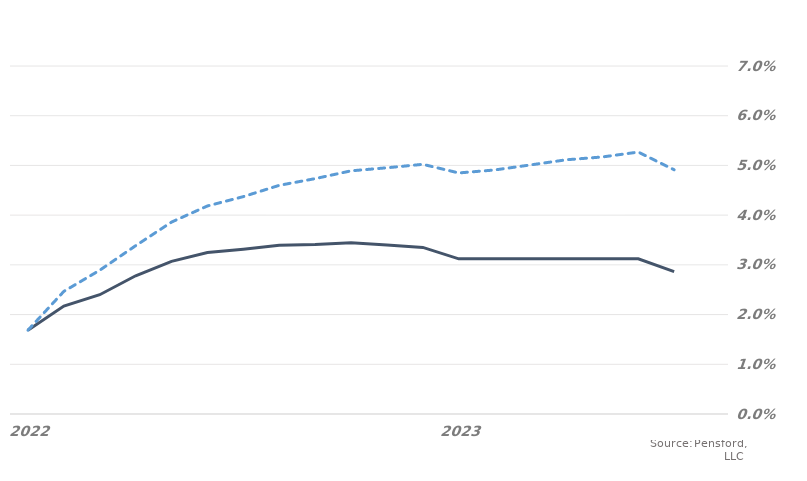
| Category | MARKET EXPECTATIONS | +1 Standard Deviation |
|---|---|---|
| 2022-06-30 | 0.017 | 0.017 |
| 2022-07-30 | 0.022 | 0.025 |
| 2022-08-30 | 0.024 | 0.029 |
| 2022-09-30 | 0.028 | 0.034 |
| 2022-10-30 | 0.031 | 0.039 |
| 2022-11-30 | 0.032 | 0.042 |
| 2022-12-30 | 0.033 | 0.044 |
| 2023-01-30 | 0.034 | 0.046 |
| 2023-02-28 | 0.034 | 0.047 |
| 2023-03-28 | 0.034 | 0.049 |
| 2023-04-28 | 0.034 | 0.05 |
| 2023-05-28 | 0.034 | 0.05 |
| 2023-06-28 | 0.031 | 0.048 |
| 2023-07-28 | 0.031 | 0.049 |
| 2023-08-28 | 0.031 | 0.05 |
| 2023-09-28 | 0.031 | 0.051 |
| 2023-10-28 | 0.031 | 0.052 |
| 2023-11-28 | 0.031 | 0.053 |
| 2023-12-28 | 0.029 | 0.049 |
| 2024-01-28 | 0.028 | 0.049 |
| 2024-02-28 | 0.028 | 0.049 |
| 2024-03-28 | 0.028 | 0.05 |
| 2024-04-28 | 0.028 | 0.049 |
| 2024-05-28 | 0.028 | 0.048 |
| 2024-06-28 | 0.026 | 0.046 |
| 2024-07-28 | 0.026 | 0.045 |
| 2024-08-28 | 0.026 | 0.046 |
| 2024-09-28 | 0.026 | 0.046 |
| 2024-10-28 | 0.026 | 0.047 |
| 2024-11-28 | 0.026 | 0.047 |
| 2024-12-28 | 0.026 | 0.047 |
| 2025-01-28 | 0.026 | 0.048 |
| 2025-02-28 | 0.026 | 0.048 |
| 2025-03-28 | 0.026 | 0.048 |
| 2025-04-28 | 0.026 | 0.049 |
| 2025-05-28 | 0.026 | 0.049 |
| 2025-06-28 | 0.026 | 0.049 |
| 2025-07-28 | 0.026 | 0.05 |
| 2025-08-28 | 0.026 | 0.05 |
| 2025-09-28 | 0.026 | 0.05 |
| 2025-10-28 | 0.026 | 0.051 |
| 2025-11-28 | 0.026 | 0.051 |
| 2025-12-28 | 0.026 | 0.051 |
| 2026-01-28 | 0.026 | 0.052 |
| 2026-02-28 | 0.026 | 0.052 |
| 2026-03-28 | 0.026 | 0.052 |
| 2026-04-28 | 0.026 | 0.052 |
| 2026-05-28 | 0.026 | 0.052 |
| 2026-06-28 | 0.027 | 0.052 |
| 2026-07-28 | 0.027 | 0.052 |
| 2026-08-28 | 0.027 | 0.053 |
| 2026-09-28 | 0.027 | 0.053 |
| 2026-10-28 | 0.027 | 0.053 |
| 2026-11-28 | 0.027 | 0.053 |
| 2026-12-28 | 0.027 | 0.054 |
| 2027-01-28 | 0.027 | 0.054 |
| 2027-02-28 | 0.027 | 0.054 |
| 2027-03-28 | 0.027 | 0.054 |
| 2027-04-28 | 0.027 | 0.054 |
| 2027-05-28 | 0.027 | 0.054 |
| 2027-06-28 | 0.027 | 0.054 |
| 2027-07-28 | 0.027 | 0.054 |
| 2027-08-28 | 0.027 | 0.055 |
| 2027-09-28 | 0.027 | 0.055 |
| 2027-10-28 | 0.027 | 0.055 |
| 2027-11-28 | 0.027 | 0.055 |
| 2027-12-28 | 0.027 | 0.055 |
| 2028-01-28 | 0.027 | 0.056 |
| 2028-02-28 | 0.027 | 0.056 |
| 2028-03-28 | 0.027 | 0.056 |
| 2028-04-28 | 0.027 | 0.056 |
| 2028-05-28 | 0.027 | 0.055 |
| 2028-06-28 | 0.027 | 0.055 |
| 2028-07-28 | 0.027 | 0.055 |
| 2028-08-28 | 0.027 | 0.055 |
| 2028-09-28 | 0.027 | 0.056 |
| 2028-10-28 | 0.027 | 0.056 |
| 2028-11-28 | 0.027 | 0.056 |
| 2028-12-28 | 0.027 | 0.056 |
| 2029-01-28 | 0.027 | 0.056 |
| 2029-02-28 | 0.027 | 0.057 |
| 2029-03-28 | 0.027 | 0.057 |
| 2029-04-28 | 0.027 | 0.057 |
| 2029-05-28 | 0.027 | 0.058 |
| 2029-06-28 | 0.028 | 0.059 |
| 2029-07-28 | 0.028 | 0.059 |
| 2029-08-28 | 0.028 | 0.06 |
| 2029-09-28 | 0.028 | 0.06 |
| 2029-10-28 | 0.028 | 0.06 |
| 2029-11-28 | 0.028 | 0.06 |
| 2029-12-28 | 0.028 | 0.06 |
| 2030-01-28 | 0.028 | 0.061 |
| 2030-02-28 | 0.028 | 0.061 |
| 2030-03-28 | 0.028 | 0.061 |
| 2030-04-28 | 0.028 | 0.059 |
| 2030-05-28 | 0.028 | 0.058 |
| 2030-06-28 | 0.028 | 0.057 |
| 2030-07-28 | 0.028 | 0.058 |
| 2030-08-28 | 0.028 | 0.058 |
| 2030-09-28 | 0.028 | 0.058 |
| 2030-10-28 | 0.028 | 0.058 |
| 2030-11-28 | 0.028 | 0.058 |
| 2030-12-28 | 0.028 | 0.059 |
| 2031-01-28 | 0.028 | 0.059 |
| 2031-02-28 | 0.028 | 0.059 |
| 2031-03-28 | 0.028 | 0.059 |
| 2031-04-28 | 0.028 | 0.058 |
| 2031-05-28 | 0.028 | 0.057 |
| 2031-06-28 | 0.029 | 0.057 |
| 2031-07-28 | 0.029 | 0.058 |
| 2031-08-28 | 0.029 | 0.058 |
| 2031-09-28 | 0.03 | 0.058 |
| 2031-10-28 | 0.029 | 0.058 |
| 2031-11-28 | 0.029 | 0.059 |
| 2031-12-28 | 0.029 | 0.059 |
| 2032-01-28 | 0.029 | 0.059 |
| 2032-02-28 | 0.029 | 0.059 |
| 2032-03-28 | 0.029 | 0.059 |
| 2032-04-28 | 0.029 | 0.058 |
| 2032-05-28 | 0.029 | 0.058 |